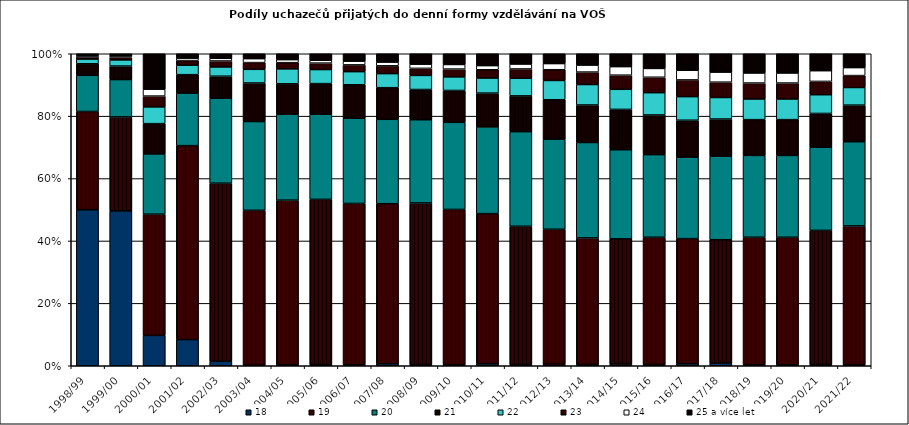
| Category | 18 | 19 | 20 | 21 | 22 | 23 | 24 | 25 a více let  |
|---|---|---|---|---|---|---|---|---|
| 1998/99 | 0.5 | 0.315 | 0.116 | 0.037 | 0.015 | 0.007 | 0.005 | 0.006 |
| 1999/00 | 0.496 | 0.301 | 0.12 | 0.043 | 0.02 | 0.008 | 0.005 | 0.007 |
| 2000/01 | 0.097 | 0.389 | 0.193 | 0.097 | 0.054 | 0.035 | 0.022 | 0.114 |
| 2001/02 | 0.084 | 0.622 | 0.168 | 0.059 | 0.03 | 0.015 | 0.008 | 0.014 |
| 2002/03 | 0.014 | 0.571 | 0.272 | 0.071 | 0.03 | 0.019 | 0.009 | 0.015 |
| 2003/04 | 0.002 | 0.496 | 0.284 | 0.124 | 0.044 | 0.022 | 0.013 | 0.016 |
| 2004/05 | 0.003 | 0.528 | 0.275 | 0.098 | 0.048 | 0.02 | 0.01 | 0.019 |
| 2005/06 | 0.003 | 0.53 | 0.273 | 0.098 | 0.045 | 0.021 | 0.009 | 0.021 |
| 2006/07 | 0.003 | 0.517 | 0.273 | 0.107 | 0.042 | 0.022 | 0.012 | 0.024 |
| 2007/08 | 0.006 | 0.513 | 0.271 | 0.101 | 0.045 | 0.025 | 0.012 | 0.027 |
| 2008/09 | 0.004 | 0.518 | 0.267 | 0.097 | 0.045 | 0.023 | 0.013 | 0.033 |
| 2009/10 | 0.003 | 0.498 | 0.279 | 0.102 | 0.043 | 0.025 | 0.015 | 0.034 |
| 2010/11 | 0.006 | 0.481 | 0.278 | 0.108 | 0.048 | 0.027 | 0.013 | 0.038 |
| 2011/12 | 0.004 | 0.443 | 0.303 | 0.115 | 0.056 | 0.03 | 0.016 | 0.033 |
| 2012/13 | 0.005 | 0.433 | 0.289 | 0.126 | 0.062 | 0.034 | 0.02 | 0.031 |
| 2013/14 | 0.004 | 0.405 | 0.306 | 0.12 | 0.065 | 0.04 | 0.022 | 0.036 |
| 2014/15 | 0.006 | 0.401 | 0.286 | 0.129 | 0.064 | 0.045 | 0.027 | 0.041 |
| 2015/16 | 0.004 | 0.408 | 0.265 | 0.127 | 0.071 | 0.05 | 0.028 | 0.047 |
| 2016/17 | 0.006 | 0.401 | 0.261 | 0.119 | 0.076 | 0.054 | 0.031 | 0.053 |
| 2017/18 | 0.008 | 0.395 | 0.268 | 0.119 | 0.069 | 0.049 | 0.032 | 0.059 |
| 2018/19 | 0.003 | 0.408 | 0.262 | 0.115 | 0.066 | 0.051 | 0.032 | 0.062 |
| 2019/20 | 0.003 | 0.408 | 0.262 | 0.115 | 0.066 | 0.051 | 0.032 | 0.062 |
| 2020/21 | 0.005 | 0.429 | 0.266 | 0.108 | 0.06 | 0.043 | 0.034 | 0.054 |
| 2021/22 | 0.004 | 0.444 | 0.27 | 0.117 | 0.056 | 0.038 | 0.026 | 0.044 |